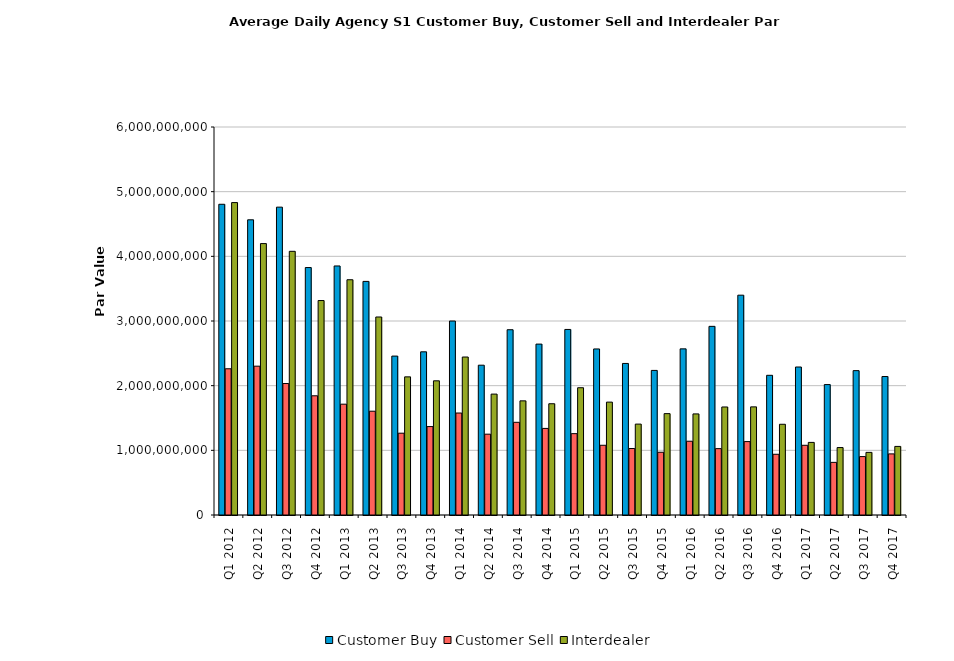
| Category | Customer Buy | Customer Sell | Interdealer |
|---|---|---|---|
| Q1 2012 | 4805131828.855 | 2261198234.689 | 4831201719.361 |
| Q2 2012 | 4564915316.16 | 2301348797.814 | 4197235917.869 |
| Q3 2012 | 4760626093.801 | 2033059819.746 | 4077567226.814 |
| Q4 2012 | 3826428782.592 | 1843370485.961 | 3316352390.939 |
| Q1 2013 | 3851219631.559 | 1713833452.241 | 3638013212.416 |
| Q2 2013 | 3612298106.7 | 1604934714.305 | 3062072229.235 |
| Q3 2013 | 2457537054.322 | 1264949555.257 | 2136022394.579 |
| Q4 2013 | 2523325341.425 | 1367516311.497 | 2074871198.099 |
| Q1 2014 | 2999642469.29 | 1576921705.138 | 2442904685.331 |
| Q2 2014 | 2316486911.388 | 1249686632.744 | 1869449035.493 |
| Q3 2014 | 2865047105.23 | 1433524489.264 | 1765300999.422 |
| Q4 2014 | 2642657071.748 | 1338943238.666 | 1720591089.445 |
| Q1 2015 | 2869493112.013 | 1258061076.446 | 1968039936.123 |
| Q2 2015 | 2567878881.385 | 1078331270.284 | 1745613692.501 |
| Q3 2015 | 2343524919.084 | 1028269042.485 | 1405607771.711 |
| Q4 2015 | 2235759044.268 | 970391456.275 | 1567503454.138 |
| Q1 2016 | 2568983491.342 | 1140791292.575 | 1563195402.666 |
| Q2 2016 | 2917274475.03 | 1026356965.009 | 1670545845.46 |
| Q3 2016 | 3399325753.161 | 1135281635.486 | 1672242018.388 |
| Q4 2016 | 2160327281.462 | 939002830.424 | 1403044499.216 |
| Q1 2017 | 2288549096.546 | 1078026778.301 | 1122683290.019 |
| Q2 2017 | 2016854071.308 | 813934660.294 | 1043002274.748 |
| Q3 2017 | 2232465339.305 | 903380763.894 | 968337710.99 |
| Q4 2017 | 2141415256.413 | 944944928.291 | 1060535846.087 |